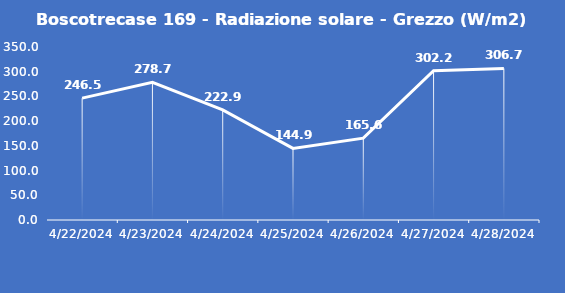
| Category | Boscotrecase 169 - Radiazione solare - Grezzo (W/m2) |
|---|---|
| 4/22/24 | 246.5 |
| 4/23/24 | 278.7 |
| 4/24/24 | 222.9 |
| 4/25/24 | 144.9 |
| 4/26/24 | 165.6 |
| 4/27/24 | 302.2 |
| 4/28/24 | 306.7 |